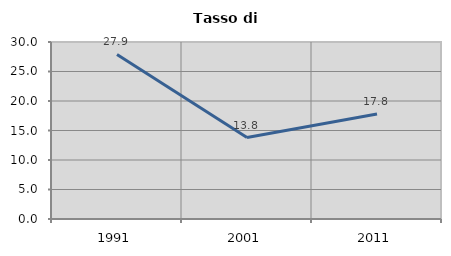
| Category | Tasso di disoccupazione   |
|---|---|
| 1991.0 | 27.882 |
| 2001.0 | 13.804 |
| 2011.0 | 17.813 |